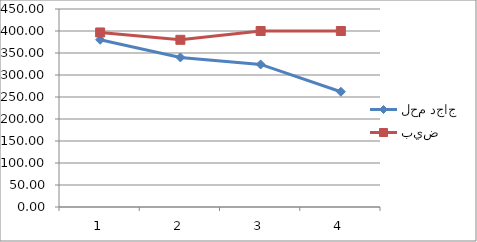
| Category | لحم دجاج | بيض |
|---|---|---|
| 0 | 380 | 396.667 |
| 1 | 340 | 380 |
| 2 | 324 | 400 |
| 3 | 262 | 400 |